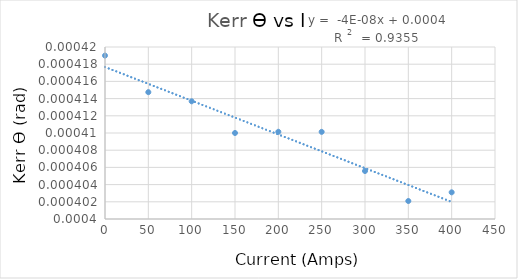
| Category | Series 0 |
|---|---|
| 0.0 | 0 |
| 50.0 | 0 |
| 100.0 | 0 |
| 150.0 | 0 |
| 200.0 | 0 |
| 250.0 | 0 |
| 300.0 | 0 |
| 350.0 | 0 |
| 400.0 | 0 |